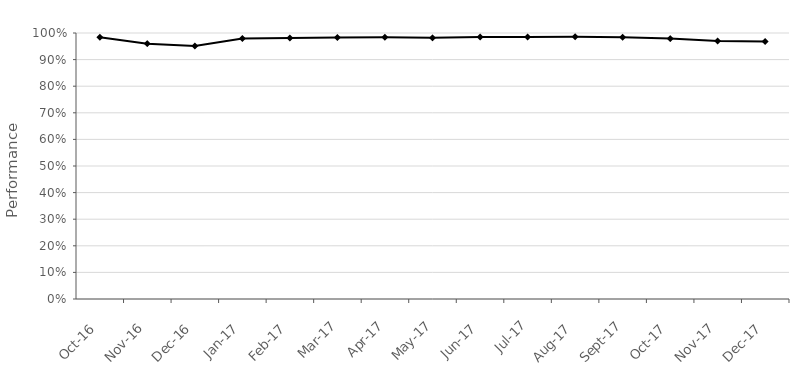
| Category | SL 4A |
|---|---|
| 2016-10-01 | 0.984 |
| 2016-11-01 | 0.96 |
| 2016-12-01 | 0.951 |
| 2017-01-01 | 0.979 |
| 2017-02-01 | 0.981 |
| 2017-03-01 | 0.983 |
| 2017-04-01 | 0.984 |
| 2017-05-01 | 0.982 |
| 2017-06-01 | 0.985 |
| 2017-07-01 | 0.985 |
| 2017-08-01 | 0.986 |
| 2017-09-01 | 0.984 |
| 2017-10-01 | 0.979 |
| 2017-11-01 | 0.97 |
| 2017-12-01 | 0.968 |